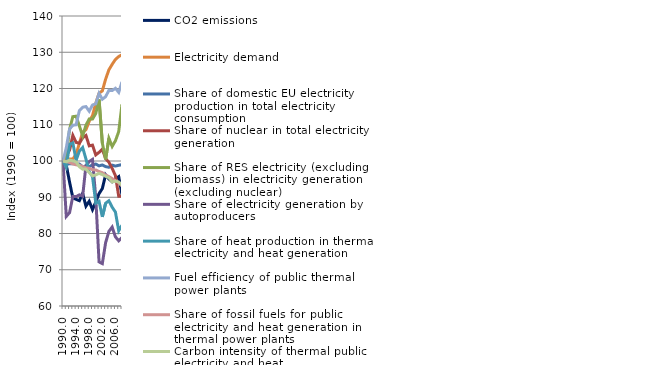
| Category | CO2 emissions | Electricity demand | Share of domestic EU electricity production in total electricity consumption | Share of nuclear in total electricity generation | Share of RES electricity (excluding biomass) in electricity generation (excluding nuclear) | Share of electricity generation by autoproducers | Share of heat production in thermal electricity and heat generation | Fuel efficiency of public thermal power plants | Share of fossil fuels for public electricity and heat generation in thermal power plants | Carbon intensity of thermal public electricity and heat  |
|---|---|---|---|---|---|---|---|---|---|---|
| 1990.0 | 100 | 100 | 100 | 100 | 100 | 100 | 100 | 100 | 100 | 100 |
| 1991.0 | 98.875 | 100.764 | 99.069 | 101.439 | 101.344 | 84.715 | 98.319 | 103.646 | 99.866 | 99.77 |
| 1992.0 | 94.206 | 100.51 | 99.247 | 102.985 | 108.719 | 85.759 | 104.611 | 108.811 | 99.582 | 100.245 |
| 1993.0 | 89.825 | 100.537 | 99.262 | 107.063 | 112.233 | 90.208 | 104.992 | 109.858 | 99.195 | 100.062 |
| 1994.0 | 89.421 | 101.887 | 99.139 | 105.131 | 112.352 | 90.169 | 100.222 | 109.99 | 98.947 | 99.732 |
| 1995.0 | 89.055 | 104.872 | 99.151 | 104.895 | 109.655 | 90.665 | 102.727 | 113.913 | 98.813 | 98.418 |
| 1996.0 | 91.057 | 107.926 | 98.399 | 106.417 | 106.911 | 90.296 | 103.726 | 114.833 | 98.513 | 97.752 |
| 1997.0 | 87.534 | 108.648 | 98.609 | 107.048 | 109.884 | 98.738 | 100.557 | 115.013 | 98.088 | 97.771 |
| 1998.0 | 88.886 | 110.972 | 98.482 | 104.174 | 111.586 | 99.846 | 97.043 | 113.742 | 97.984 | 96.844 |
| 1999.0 | 86.585 | 112.523 | 98.891 | 104.38 | 111.568 | 100.452 | 95.723 | 115.449 | 97.609 | 95.902 |
| 2000.0 | 88.685 | 115.947 | 99.159 | 101.68 | 113.12 | 89.828 | 88.363 | 115.786 | 97.524 | 96.172 |
| 2001.0 | 91.012 | 118.705 | 98.662 | 102.385 | 116.969 | 72.168 | 88.872 | 118.646 | 97.102 | 96.588 |
| 2002.0 | 92.398 | 119.335 | 98.908 | 103.261 | 104.919 | 71.688 | 84.584 | 117.043 | 96.779 | 96.247 |
| 2003.0 | 96.184 | 122.577 | 98.45 | 100.649 | 100.459 | 77.462 | 88.346 | 117.734 | 96.125 | 95.787 |
| 2004.0 | 95.07 | 125.149 | 98.277 | 99.656 | 106.262 | 80.579 | 89.024 | 119.496 | 95.695 | 95.393 |
| 2005.0 | 94.29 | 126.668 | 98.85 | 97.964 | 104.02 | 81.784 | 87.263 | 119.431 | 95.15 | 94.216 |
| 2006.0 | 95.095 | 128.014 | 98.609 | 95.946 | 105.587 | 79.072 | 85.9 | 120.057 | 94.536 | 94.449 |
| 2007.0 | 95.684 | 128.822 | 98.819 | 90.272 | 108.114 | 77.975 | 80.745 | 118.938 | 94.057 | 94.195 |
| 2008.0 | 90.687 | 129.298 | 98.998 | 90.287 | 115.676 | 78.923 | 82.275 | 121.819 | 93.098 | 93.317 |